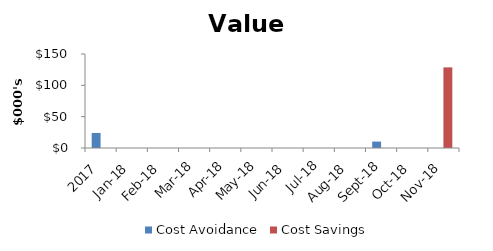
| Category | Cost Avoidance | Cost Savings |
|---|---|---|
| 2017.0 | 24000 | 0 |
| 43101.0 | 0 | 0 |
| 43132.0 | 0 | 0 |
| 43160.0 | 0 | 0 |
| 43191.0 | 0 | 0 |
| 43221.0 | 0 | 0 |
| 43252.0 | 0 | 0 |
| 43282.0 | 0 | 0 |
| 43313.0 | 0 | 0 |
| 43344.0 | 10236.42 | 0 |
| 43374.0 | 0 | 0 |
| 43405.0 | 0 | 128676 |